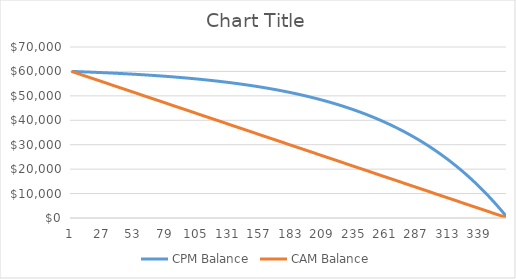
| Category | CPM Balance | CAM Balance |
|---|---|---|
| 0 | 60000 | 60000 |
| 1 | 59982.832 | 59833.333 |
| 2 | 59965.493 | 59666.667 |
| 3 | 59947.981 | 59500 |
| 4 | 59930.293 | 59333.333 |
| 5 | 59912.428 | 59166.667 |
| 6 | 59894.385 | 59000 |
| 7 | 59876.161 | 58833.333 |
| 8 | 59857.755 | 58666.667 |
| 9 | 59839.165 | 58500 |
| 10 | 59820.389 | 58333.333 |
| 11 | 59801.426 | 58166.667 |
| 12 | 59782.272 | 58000 |
| 13 | 59762.928 | 57833.333 |
| 14 | 59743.389 | 57666.667 |
| 15 | 59723.656 | 57500 |
| 16 | 59703.725 | 57333.333 |
| 17 | 59683.594 | 57166.667 |
| 18 | 59663.263 | 57000 |
| 19 | 59642.728 | 56833.333 |
| 20 | 59621.987 | 56666.667 |
| 21 | 59601.04 | 56500 |
| 22 | 59579.883 | 56333.333 |
| 23 | 59558.514 | 56166.667 |
| 24 | 59536.931 | 56000 |
| 25 | 59515.133 | 55833.333 |
| 26 | 59493.117 | 55666.667 |
| 27 | 59470.881 | 55500 |
| 28 | 59448.422 | 55333.333 |
| 29 | 59425.739 | 55166.667 |
| 30 | 59402.828 | 55000 |
| 31 | 59379.689 | 54833.333 |
| 32 | 59356.318 | 54666.667 |
| 33 | 59332.714 | 54500 |
| 34 | 59308.874 | 54333.333 |
| 35 | 59284.795 | 54166.667 |
| 36 | 59260.475 | 54000 |
| 37 | 59235.912 | 53833.333 |
| 38 | 59211.104 | 53666.667 |
| 39 | 59186.047 | 53500 |
| 40 | 59160.74 | 53333.333 |
| 41 | 59135.18 | 53166.667 |
| 42 | 59109.364 | 53000 |
| 43 | 59083.291 | 52833.333 |
| 44 | 59056.956 | 52666.667 |
| 45 | 59030.358 | 52500 |
| 46 | 59003.494 | 52333.333 |
| 47 | 58976.361 | 52166.667 |
| 48 | 58948.957 | 52000 |
| 49 | 58921.279 | 51833.333 |
| 50 | 58893.325 | 51666.667 |
| 51 | 58865.09 | 51500 |
| 52 | 58836.574 | 51333.333 |
| 53 | 58807.772 | 51166.667 |
| 54 | 58778.682 | 51000 |
| 55 | 58749.301 | 50833.333 |
| 56 | 58719.627 | 50666.667 |
| 57 | 58689.655 | 50500 |
| 58 | 58659.384 | 50333.333 |
| 59 | 58628.811 | 50166.667 |
| 60 | 58597.931 | 50000 |
| 61 | 58566.743 | 49833.333 |
| 62 | 58535.243 | 49666.667 |
| 63 | 58503.428 | 49500 |
| 64 | 58471.294 | 49333.333 |
| 65 | 58438.84 | 49166.667 |
| 66 | 58406.061 | 49000 |
| 67 | 58372.954 | 48833.333 |
| 68 | 58339.516 | 48666.667 |
| 69 | 58305.743 | 48500 |
| 70 | 58271.633 | 48333.333 |
| 71 | 58237.182 | 48166.667 |
| 72 | 58202.386 | 48000 |
| 73 | 58167.242 | 47833.333 |
| 74 | 58131.747 | 47666.667 |
| 75 | 58095.897 | 47500 |
| 76 | 58059.689 | 47333.333 |
| 77 | 58023.118 | 47166.667 |
| 78 | 57986.182 | 47000 |
| 79 | 57948.876 | 46833.333 |
| 80 | 57911.197 | 46666.667 |
| 81 | 57873.141 | 46500 |
| 82 | 57834.705 | 46333.333 |
| 83 | 57795.885 | 46166.667 |
| 84 | 57756.676 | 46000 |
| 85 | 57717.075 | 45833.333 |
| 86 | 57677.079 | 45666.667 |
| 87 | 57636.682 | 45500 |
| 88 | 57595.881 | 45333.333 |
| 89 | 57554.672 | 45166.667 |
| 90 | 57513.051 | 45000 |
| 91 | 57471.014 | 44833.333 |
| 92 | 57428.557 | 44666.667 |
| 93 | 57385.675 | 44500 |
| 94 | 57342.364 | 44333.333 |
| 95 | 57298.62 | 44166.667 |
| 96 | 57254.439 | 44000 |
| 97 | 57209.816 | 43833.333 |
| 98 | 57164.746 | 43666.667 |
| 99 | 57119.226 | 43500 |
| 100 | 57073.251 | 43333.333 |
| 101 | 57026.816 | 43166.667 |
| 102 | 56979.916 | 43000 |
| 103 | 56932.548 | 42833.333 |
| 104 | 56884.706 | 42666.667 |
| 105 | 56836.386 | 42500 |
| 106 | 56787.582 | 42333.333 |
| 107 | 56738.29 | 42166.667 |
| 108 | 56688.505 | 42000 |
| 109 | 56638.223 | 41833.333 |
| 110 | 56587.438 | 41666.667 |
| 111 | 56536.144 | 41500 |
| 112 | 56484.338 | 41333.333 |
| 113 | 56432.014 | 41166.667 |
| 114 | 56379.167 | 41000 |
| 115 | 56325.791 | 40833.333 |
| 116 | 56271.881 | 40666.667 |
| 117 | 56217.432 | 40500 |
| 118 | 56162.439 | 40333.333 |
| 119 | 56106.896 | 40166.667 |
| 120 | 56050.797 | 40000 |
| 121 | 55994.138 | 39833.333 |
| 122 | 55936.912 | 39666.667 |
| 123 | 55879.113 | 39500 |
| 124 | 55820.737 | 39333.333 |
| 125 | 55761.777 | 39166.667 |
| 126 | 55702.227 | 39000 |
| 127 | 55642.082 | 38833.333 |
| 128 | 55581.335 | 38666.667 |
| 129 | 55519.981 | 38500 |
| 130 | 55458.013 | 38333.333 |
| 131 | 55395.425 | 38166.667 |
| 132 | 55332.212 | 38000 |
| 133 | 55268.367 | 37833.333 |
| 134 | 55203.883 | 37666.667 |
| 135 | 55138.754 | 37500 |
| 136 | 55072.974 | 37333.333 |
| 137 | 55006.536 | 37166.667 |
| 138 | 54939.434 | 37000 |
| 139 | 54871.661 | 36833.333 |
| 140 | 54803.21 | 36666.667 |
| 141 | 54734.074 | 36500 |
| 142 | 54664.248 | 36333.333 |
| 143 | 54593.722 | 36166.667 |
| 144 | 54522.492 | 36000 |
| 145 | 54450.549 | 35833.333 |
| 146 | 54377.887 | 35666.667 |
| 147 | 54304.499 | 35500 |
| 148 | 54230.376 | 35333.333 |
| 149 | 54155.512 | 35166.667 |
| 150 | 54079.9 | 35000 |
| 151 | 54003.531 | 34833.333 |
| 152 | 53926.399 | 34666.667 |
| 153 | 53848.496 | 34500 |
| 154 | 53769.813 | 34333.333 |
| 155 | 53690.344 | 34166.667 |
| 156 | 53610.079 | 34000 |
| 157 | 53529.013 | 33833.333 |
| 158 | 53447.135 | 33666.667 |
| 159 | 53364.439 | 33500 |
| 160 | 53280.916 | 33333.333 |
| 161 | 53196.557 | 33166.667 |
| 162 | 53111.355 | 33000 |
| 163 | 53025.301 | 32833.333 |
| 164 | 52938.387 | 32666.667 |
| 165 | 52850.603 | 32500 |
| 166 | 52761.942 | 32333.333 |
| 167 | 52672.394 | 32166.667 |
| 168 | 52581.95 | 32000 |
| 169 | 52490.602 | 31833.333 |
| 170 | 52398.34 | 31666.667 |
| 171 | 52305.156 | 31500 |
| 172 | 52211.04 | 31333.333 |
| 173 | 52115.983 | 31166.667 |
| 174 | 52019.975 | 31000 |
| 175 | 51923.007 | 30833.333 |
| 176 | 51825.07 | 30666.667 |
| 177 | 51726.153 | 30500 |
| 178 | 51626.247 | 30333.333 |
| 179 | 51525.342 | 30166.667 |
| 180 | 51423.428 | 30000 |
| 181 | 51320.495 | 29833.333 |
| 182 | 51216.532 | 29666.667 |
| 183 | 51111.53 | 29500 |
| 184 | 51005.478 | 29333.333 |
| 185 | 50898.365 | 29166.667 |
| 186 | 50790.181 | 29000 |
| 187 | 50680.915 | 28833.333 |
| 188 | 50570.557 | 28666.667 |
| 189 | 50459.095 | 28500 |
| 190 | 50346.518 | 28333.333 |
| 191 | 50232.816 | 28166.667 |
| 192 | 50117.976 | 28000 |
| 193 | 50001.988 | 27833.333 |
| 194 | 49884.841 | 27666.667 |
| 195 | 49766.522 | 27500 |
| 196 | 49647.019 | 27333.333 |
| 197 | 49526.322 | 27166.667 |
| 198 | 49404.418 | 27000 |
| 199 | 49281.294 | 26833.333 |
| 200 | 49156.94 | 26666.667 |
| 201 | 49031.341 | 26500 |
| 202 | 48904.487 | 26333.333 |
| 203 | 48776.365 | 26166.667 |
| 204 | 48646.961 | 26000 |
| 205 | 48516.263 | 25833.333 |
| 206 | 48384.258 | 25666.667 |
| 207 | 48250.933 | 25500 |
| 208 | 48116.275 | 25333.333 |
| 209 | 47980.27 | 25166.667 |
| 210 | 47842.905 | 25000 |
| 211 | 47704.166 | 24833.333 |
| 212 | 47564.041 | 24666.667 |
| 213 | 47422.513 | 24500 |
| 214 | 47279.571 | 24333.333 |
| 215 | 47135.199 | 24166.667 |
| 216 | 46989.384 | 24000 |
| 217 | 46842.11 | 23833.333 |
| 218 | 46693.363 | 23666.667 |
| 219 | 46543.129 | 23500 |
| 220 | 46391.393 | 23333.333 |
| 221 | 46238.14 | 23166.667 |
| 222 | 46083.353 | 23000 |
| 223 | 45927.019 | 22833.333 |
| 224 | 45769.122 | 22666.667 |
| 225 | 45609.646 | 22500 |
| 226 | 45448.575 | 22333.333 |
| 227 | 45285.893 | 22166.667 |
| 228 | 45121.584 | 22000 |
| 229 | 44955.632 | 21833.333 |
| 230 | 44788.021 | 21666.667 |
| 231 | 44618.734 | 21500 |
| 232 | 44447.754 | 21333.333 |
| 233 | 44275.064 | 21166.667 |
| 234 | 44100.647 | 21000 |
| 235 | 43924.486 | 20833.333 |
| 236 | 43746.563 | 20666.667 |
| 237 | 43566.861 | 20500 |
| 238 | 43385.362 | 20333.333 |
| 239 | 43202.048 | 20166.667 |
| 240 | 43016.901 | 20000 |
| 241 | 42829.902 | 19833.333 |
| 242 | 42641.034 | 19666.667 |
| 243 | 42450.277 | 19500 |
| 244 | 42257.612 | 19333.333 |
| 245 | 42063.02 | 19166.667 |
| 246 | 41866.483 | 19000 |
| 247 | 41667.98 | 18833.333 |
| 248 | 41467.493 | 18666.667 |
| 249 | 41265 | 18500 |
| 250 | 41060.482 | 18333.333 |
| 251 | 40853.92 | 18166.667 |
| 252 | 40645.291 | 18000 |
| 253 | 40434.577 | 17833.333 |
| 254 | 40221.755 | 17666.667 |
| 255 | 40006.805 | 17500 |
| 256 | 39789.705 | 17333.333 |
| 257 | 39570.435 | 17166.667 |
| 258 | 39348.972 | 17000 |
| 259 | 39125.294 | 16833.333 |
| 260 | 38899.379 | 16666.667 |
| 261 | 38671.205 | 16500 |
| 262 | 38440.75 | 16333.333 |
| 263 | 38207.99 | 16166.667 |
| 264 | 37972.902 | 16000 |
| 265 | 37735.464 | 15833.333 |
| 266 | 37495.651 | 15666.667 |
| 267 | 37253.44 | 15500 |
| 268 | 37008.807 | 15333.333 |
| 269 | 36761.727 | 15166.667 |
| 270 | 36512.177 | 15000 |
| 271 | 36260.131 | 14833.333 |
| 272 | 36005.565 | 14666.667 |
| 273 | 35748.453 | 14500 |
| 274 | 35488.77 | 14333.333 |
| 275 | 35226.49 | 14166.667 |
| 276 | 34961.587 | 14000 |
| 277 | 34694.036 | 13833.333 |
| 278 | 34423.808 | 13666.667 |
| 279 | 34150.879 | 13500 |
| 280 | 33875.22 | 13333.333 |
| 281 | 33596.805 | 13166.667 |
| 282 | 33315.605 | 13000 |
| 283 | 33031.594 | 12833.333 |
| 284 | 32744.742 | 12666.667 |
| 285 | 32455.022 | 12500 |
| 286 | 32162.405 | 12333.333 |
| 287 | 31866.861 | 12166.667 |
| 288 | 31568.362 | 12000 |
| 289 | 31266.878 | 11833.333 |
| 290 | 30962.379 | 11666.667 |
| 291 | 30654.836 | 11500 |
| 292 | 30344.217 | 11333.333 |
| 293 | 30030.491 | 11166.667 |
| 294 | 29713.628 | 11000 |
| 295 | 29393.597 | 10833.333 |
| 296 | 29070.366 | 10666.667 |
| 297 | 28743.902 | 10500 |
| 298 | 28414.173 | 10333.333 |
| 299 | 28081.147 | 10166.667 |
| 300 | 27744.791 | 10000 |
| 301 | 27405.072 | 9833.333 |
| 302 | 27061.955 | 9666.667 |
| 303 | 26715.407 | 9500 |
| 304 | 26365.393 | 9333.333 |
| 305 | 26011.88 | 9166.667 |
| 306 | 25654.831 | 9000 |
| 307 | 25294.212 | 8833.333 |
| 308 | 24929.986 | 8666.667 |
| 309 | 24562.119 | 8500 |
| 310 | 24190.572 | 8333.333 |
| 311 | 23815.31 | 8166.667 |
| 312 | 23436.296 | 8000 |
| 313 | 23053.491 | 7833.333 |
| 314 | 22666.859 | 7666.667 |
| 315 | 22276.36 | 7500 |
| 316 | 21881.956 | 7333.333 |
| 317 | 21483.608 | 7166.667 |
| 318 | 21081.276 | 7000 |
| 319 | 20674.921 | 6833.333 |
| 320 | 20264.503 | 6666.667 |
| 321 | 19849.981 | 6500 |
| 322 | 19431.313 | 6333.333 |
| 323 | 19008.458 | 6166.667 |
| 324 | 18581.375 | 6000 |
| 325 | 18150.022 | 5833.333 |
| 326 | 17714.354 | 5666.667 |
| 327 | 17274.33 | 5500 |
| 328 | 16829.906 | 5333.333 |
| 329 | 16381.037 | 5166.667 |
| 330 | 15927.68 | 5000 |
| 331 | 15469.79 | 4833.333 |
| 332 | 15007.32 | 4666.667 |
| 333 | 14540.225 | 4500 |
| 334 | 14068.46 | 4333.333 |
| 335 | 13591.977 | 4166.667 |
| 336 | 13110.729 | 4000 |
| 337 | 12624.669 | 3833.333 |
| 338 | 12133.748 | 3666.667 |
| 339 | 11637.918 | 3500 |
| 340 | 11137.13 | 3333.333 |
| 341 | 10631.334 | 3166.667 |
| 342 | 10120.479 | 3000 |
| 343 | 9604.517 | 2833.333 |
| 344 | 9083.394 | 2666.667 |
| 345 | 8557.061 | 2500 |
| 346 | 8025.464 | 2333.333 |
| 347 | 7488.551 | 2166.667 |
| 348 | 6946.269 | 2000 |
| 349 | 6398.564 | 1833.333 |
| 350 | 5845.382 | 1666.667 |
| 351 | 5286.668 | 1500 |
| 352 | 4722.367 | 1333.333 |
| 353 | 4152.423 | 1166.667 |
| 354 | 3576.78 | 1000 |
| 355 | 2995.38 | 833.333 |
| 356 | 2408.167 | 666.667 |
| 357 | 1815.081 | 500 |
| 358 | 1216.064 | 333.333 |
| 359 | 611.057 | 166.667 |